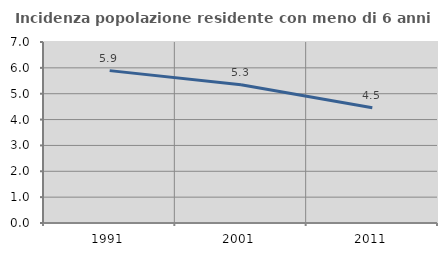
| Category | Incidenza popolazione residente con meno di 6 anni |
|---|---|
| 1991.0 | 5.893 |
| 2001.0 | 5.346 |
| 2011.0 | 4.454 |